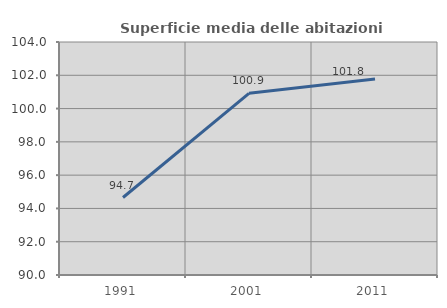
| Category | Superficie media delle abitazioni occupate |
|---|---|
| 1991.0 | 94.655 |
| 2001.0 | 100.917 |
| 2011.0 | 101.771 |